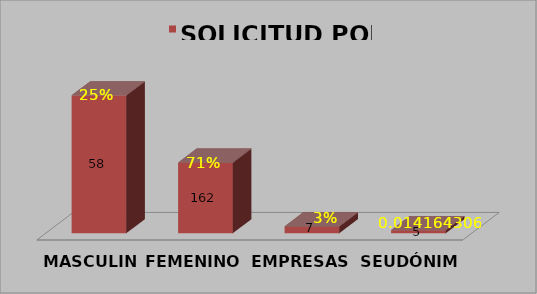
| Category | SOLICITUD POR GÉNERO |
|---|---|
| MASCULINO | 0.323 |
| FEMENINO | 0.632 |
| EMPRESAS | 0.031 |
| SEUDÓNIMO | 0.014 |